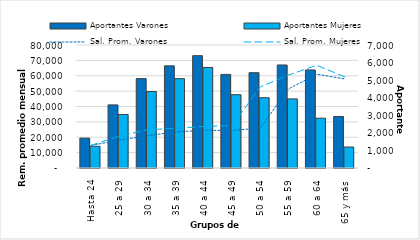
| Category | Aportantes Varones | Aportantes Mujeres |
|---|---|---|
| Hasta 24 | 1700 | 1235 |
| 25 a 29 | 3591 | 3046 |
| 30 a 34 | 5087 | 4354 |
| 35 a 39 | 5812 | 5086 |
| 40 a 44 | 6393 | 5722 |
| 45 a 49 | 5326 | 4173 |
| 50 a 54 | 5425 | 4001 |
| 55 a 59 | 5863 | 3932 |
| 60 a 64 | 5581 | 2834 |
| 65 y más | 2933 | 1194 |